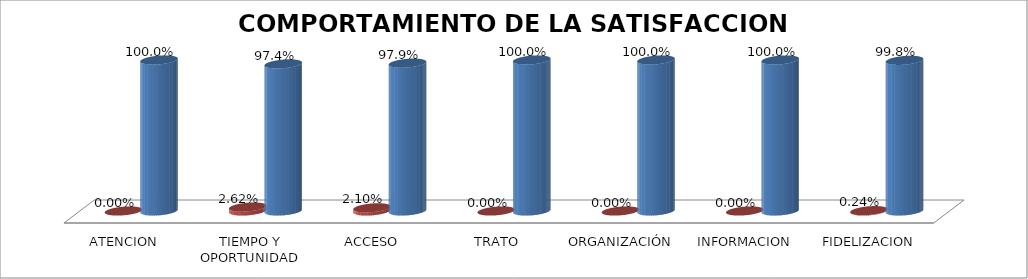
| Category | TOTAL |
|---|---|
| ATENCION | 1 |
| TIEMPO Y OPORTUNIDAD | 0.974 |
| ACCESO | 0.979 |
| TRATO | 1 |
| ORGANIZACIÓN | 1 |
| INFORMACION | 1 |
| FIDELIZACION | 0.998 |